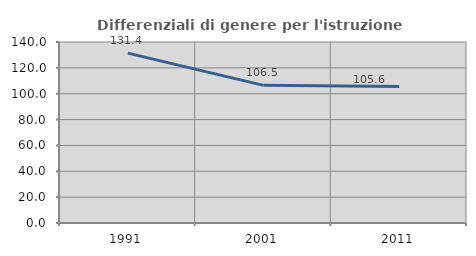
| Category | Differenziali di genere per l'istruzione superiore |
|---|---|
| 1991.0 | 131.373 |
| 2001.0 | 106.466 |
| 2011.0 | 105.558 |